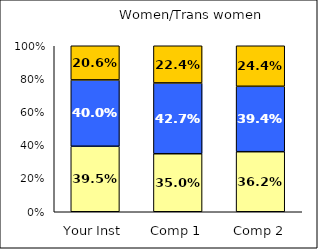
| Category | Low College Reputation Orientation | Average College Reputation Orientation | High College Reputation Orientation |
|---|---|---|---|
| Your Inst | 0.395 | 0.4 | 0.206 |
| Comp 1 | 0.35 | 0.427 | 0.224 |
| Comp 2 | 0.362 | 0.394 | 0.244 |